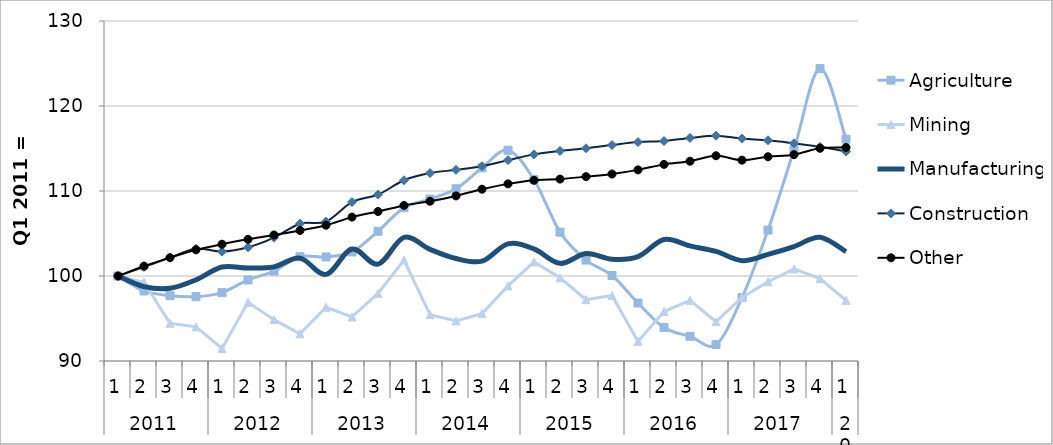
| Category | Agriculture | Mining | Manufacturing | Construction | Other |
|---|---|---|---|---|---|
| 0 | 100 | 100 | 100 | 100 | 100 |
| 1 | 98.24 | 99.268 | 98.753 | 101.06 | 101.162 |
| 2 | 97.682 | 94.437 | 98.552 | 102.172 | 102.155 |
| 3 | 97.57 | 94.023 | 99.553 | 103.206 | 103.076 |
| 4 | 98.048 | 91.473 | 101.063 | 102.872 | 103.743 |
| 5 | 99.534 | 96.902 | 100.94 | 103.373 | 104.315 |
| 6 | 100.575 | 94.863 | 101.071 | 104.51 | 104.825 |
| 7 | 102.276 | 93.203 | 102.103 | 106.155 | 105.355 |
| 8 | 102.243 | 96.326 | 100.195 | 106.405 | 105.975 |
| 9 | 102.829 | 95.191 | 103.177 | 108.699 | 106.929 |
| 10 | 105.261 | 97.946 | 101.392 | 109.572 | 107.587 |
| 11 | 108.038 | 101.871 | 104.542 | 111.263 | 108.305 |
| 12 | 109.045 | 95.458 | 103.137 | 112.109 | 108.795 |
| 13 | 110.262 | 94.712 | 102.056 | 112.489 | 109.423 |
| 14 | 112.724 | 95.58 | 101.75 | 112.915 | 110.216 |
| 15 | 114.796 | 98.833 | 103.785 | 113.63 | 110.839 |
| 16 | 111.329 | 101.661 | 103.185 | 114.308 | 111.262 |
| 17 | 105.163 | 99.787 | 101.487 | 114.71 | 111.401 |
| 18 | 101.877 | 97.22 | 102.639 | 115.023 | 111.69 |
| 19 | 100.061 | 97.707 | 101.968 | 115.407 | 111.999 |
| 20 | 96.823 | 92.309 | 102.271 | 115.751 | 112.484 |
| 21 | 93.927 | 95.814 | 104.295 | 115.881 | 113.134 |
| 22 | 92.906 | 97.133 | 103.547 | 116.24 | 113.506 |
| 23 | 91.939 | 94.622 | 102.887 | 116.502 | 114.147 |
| 24 | 97.453 | 97.477 | 101.803 | 116.165 | 113.631 |
| 25 | 105.403 | 99.328 | 102.542 | 115.969 | 114.033 |
| 26 | 114.878 | 100.828 | 103.468 | 115.607 | 114.273 |
| 27 | 124.401 | 99.693 | 104.566 | 115.197 | 115.028 |
| 28 | 116.095 | 97.134 | 102.857 | 114.649 | 115.113 |